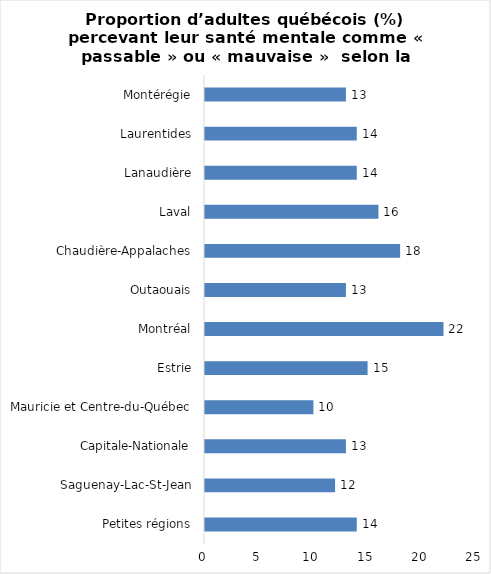
| Category | Series 0 |
|---|---|
| Petites régions | 14 |
| Saguenay-Lac-St-Jean | 12 |
| Capitale-Nationale | 13 |
| Mauricie et Centre-du-Québec | 10 |
| Estrie | 15 |
| Montréal | 22 |
| Outaouais | 13 |
| Chaudière-Appalaches | 18 |
| Laval | 16 |
| Lanaudière | 14 |
| Laurentides | 14 |
| Montérégie | 13 |